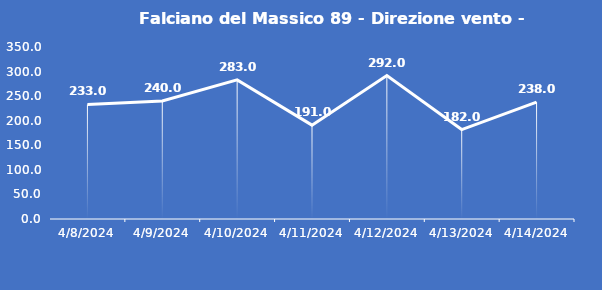
| Category | Falciano del Massico 89 - Direzione vento - Grezzo (°N) |
|---|---|
| 4/8/24 | 233 |
| 4/9/24 | 240 |
| 4/10/24 | 283 |
| 4/11/24 | 191 |
| 4/12/24 | 292 |
| 4/13/24 | 182 |
| 4/14/24 | 238 |